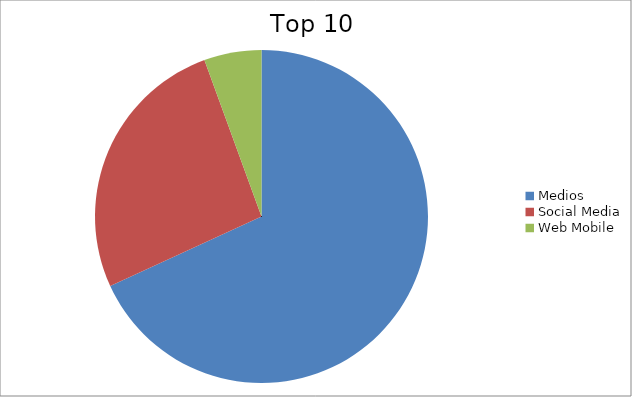
| Category | Series 0 |
|---|---|
| Medios | 68.14 |
| Social Media | 26.29 |
| Web Mobile | 5.57 |